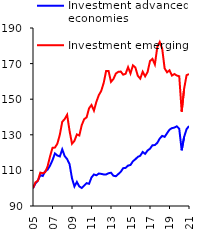
| Category | Investment advanced economies | Investment emerging economies |
|---|---|---|
| 2005-03-31 | 100 | 100 |
| 2005-06-30 | 102.669 | 103.248 |
| 2005-09-30 | 104.258 | 104.155 |
| 2005-12-31 | 107.341 | 108.758 |
| 2006-03-31 | 106.867 | 108.432 |
| 2006-06-30 | 109.475 | 109.016 |
| 2006-09-30 | 110.48 | 112.307 |
| 2006-12-31 | 112.709 | 117.948 |
| 2007-03-31 | 115.723 | 122.68 |
| 2007-06-30 | 119.531 | 122.827 |
| 2007-09-30 | 118.367 | 125.025 |
| 2007-12-31 | 117.832 | 130.009 |
| 2008-03-31 | 121.819 | 137.299 |
| 2008-06-30 | 118.038 | 138.84 |
| 2008-09-30 | 116.359 | 141.224 |
| 2008-12-31 | 113.529 | 132.209 |
| 2009-03-31 | 105.541 | 124.98 |
| 2009-06-30 | 100.991 | 126.598 |
| 2009-09-30 | 103.514 | 130.218 |
| 2009-12-31 | 100.972 | 129.606 |
| 2010-03-31 | 100.138 | 135.445 |
| 2010-06-30 | 101.516 | 138.794 |
| 2010-09-30 | 102.837 | 139.821 |
| 2010-12-31 | 102.466 | 144.902 |
| 2011-03-31 | 106.043 | 146.739 |
| 2011-06-30 | 107.718 | 143.581 |
| 2011-09-30 | 107.243 | 148.546 |
| 2011-12-31 | 108.236 | 152.275 |
| 2012-03-31 | 108.04 | 154.671 |
| 2012-06-30 | 107.72 | 159.131 |
| 2012-09-30 | 107.738 | 165.878 |
| 2012-12-31 | 108.406 | 165.849 |
| 2013-03-31 | 108.7 | 159.752 |
| 2013-06-30 | 106.989 | 161.332 |
| 2013-09-30 | 106.732 | 164.421 |
| 2013-12-31 | 107.942 | 165.364 |
| 2014-03-31 | 109.2 | 165.532 |
| 2014-06-30 | 111.249 | 163.76 |
| 2014-09-30 | 111.415 | 164.305 |
| 2014-12-31 | 112.699 | 167.994 |
| 2015-03-31 | 113.066 | 164.456 |
| 2015-06-30 | 115.157 | 169.007 |
| 2015-09-30 | 116.259 | 167.806 |
| 2015-12-31 | 117.593 | 163.152 |
| 2016-03-31 | 118.227 | 161.563 |
| 2016-06-30 | 120.355 | 165.445 |
| 2016-09-30 | 119.298 | 162.837 |
| 2016-12-31 | 121.163 | 165.229 |
| 2017-03-31 | 122.176 | 171.421 |
| 2017-06-30 | 124.124 | 172.656 |
| 2017-09-30 | 124.223 | 169.516 |
| 2017-12-31 | 125.465 | 179.312 |
| 2018-03-31 | 127.922 | 182.127 |
| 2018-06-30 | 129.388 | 178.428 |
| 2018-09-30 | 128.857 | 167.327 |
| 2018-12-31 | 130.912 | 165.101 |
| 2019-03-31 | 132.871 | 166.232 |
| 2019-06-30 | 133.756 | 163.284 |
| 2019-09-30 | 134.055 | 164.143 |
| 2019-12-31 | 134.78 | 163.301 |
| 2020-03-31 | 133.341 | 162.888 |
| 2020-06-30 | 121.301 | 142.988 |
| 2020-09-30 | 128.817 | 155.894 |
| 2020-12-31 | 133.165 | 163.465 |
| 2021-03-31 | 134.88 | 164.105 |